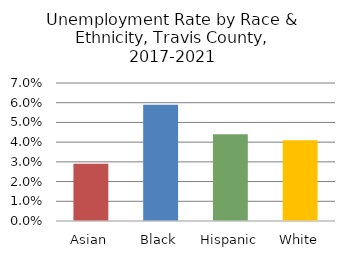
| Category | Series 0 |
|---|---|
| Asian | 0.029 |
| Black | 0.059 |
| Hispanic | 0.044 |
| White | 0.041 |